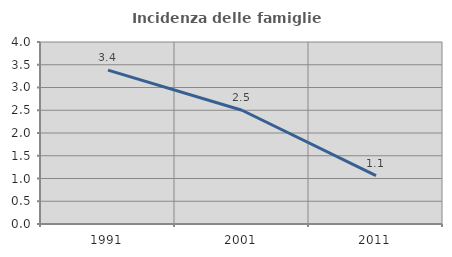
| Category | Incidenza delle famiglie numerose |
|---|---|
| 1991.0 | 3.382 |
| 2001.0 | 2.5 |
| 2011.0 | 1.063 |